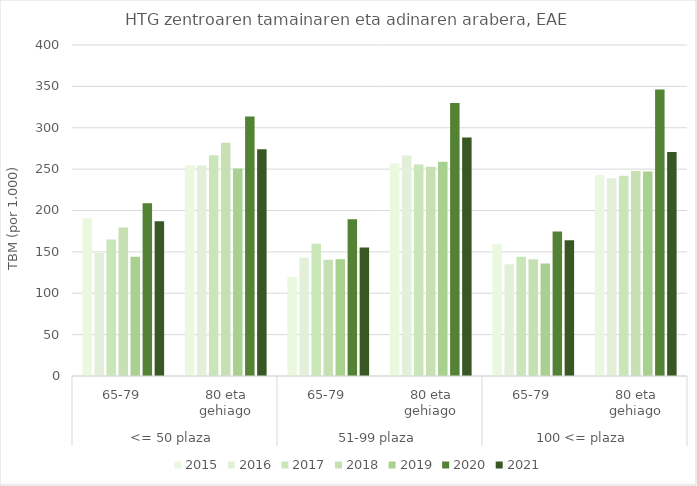
| Category | 2015 | 2016 | 2017 | 2018 | 2019 | 2020 | 2021 |
|---|---|---|---|---|---|---|---|
| 0 | 190.769 | 148.525 | 164.929 | 179.599 | 144.112 | 208.85 | 186.869 |
| 1 | 254.733 | 254.79 | 266.74 | 281.931 | 250.715 | 313.639 | 273.884 |
| 2 | 119.76 | 142.857 | 159.943 | 140.571 | 141.113 | 189.383 | 155.145 |
| 3 | 256.769 | 266.502 | 255.548 | 252.836 | 258.901 | 329.959 | 288.222 |
| 4 | 159.321 | 135.114 | 144.074 | 141.167 | 135.838 | 174.743 | 164.009 |
| 5 | 242.854 | 238.848 | 242.027 | 247.635 | 247.217 | 346.091 | 270.62 |